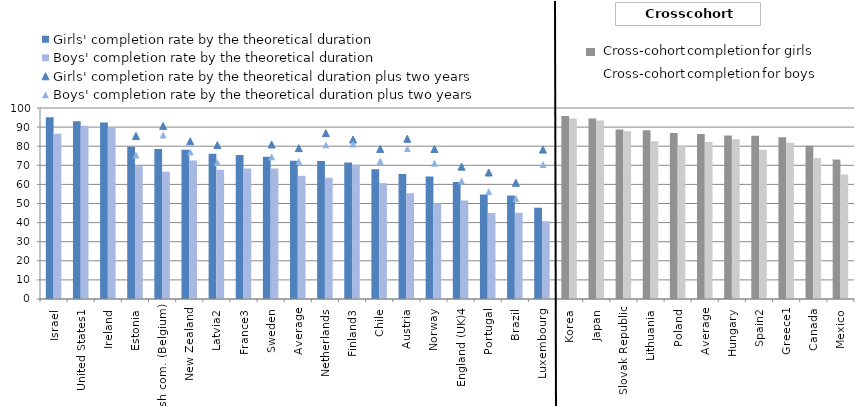
| Category | Girls' completion rate by the theoretical duration | Boys' completion rate by the theoretical duration |
|---|---|---|
| Israel | 95.134 | 86.461 |
| United States1 | 93.11 | 90.752 |
| Ireland | 92.461 | 89.617 |
| Estonia | 79.661 | 69.568 |
| Flemish com. (Belgium) | 78.472 | 66.66 |
| New Zealand | 78.15 | 72.475 |
| Latvia2 | 76.061 | 67.64 |
| France3 | 75.385 | 68.372 |
| Sweden | 74.509 | 68.354 |
| Average | 72.344 | 64.578 |
| Netherlands | 72.245 | 63.485 |
| Finland3 | 71.489 | 70.325 |
| Chile | 67.949 | 60.641 |
| Austria | 65.432 | 55.345 |
| Norway | 64.159 | 50.089 |
| England (UK)4 | 61.3 | 51.6 |
| Portugal | 54.712 | 45.078 |
| Brazil | 54.159 | 45.172 |
| Luxembourg | 47.798 | 40.78 |
| Korea | 95.754 | 94.516 |
| Japan | 94.451 | 93.478 |
| Slovak Republic | 88.747 | 87.836 |
| Lithuania | 88.37 | 82.59 |
| Poland | 86.923 | 80.452 |
| Average | 86.33 | 82.155 |
| Hungary | 85.568 | 83.67 |
| Spain2 | 85.454 | 78.198 |
| Greece1 | 84.71 | 81.814 |
| Canada | 80.295 | 73.823 |
| Mexico | 73.031 | 65.167 |